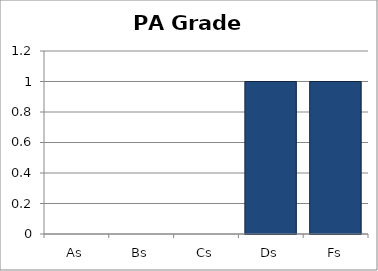
| Category | Distribution of Grades |
|---|---|
| As | 0 |
| Bs | 0 |
| Cs | 0 |
| Ds | 1 |
| Fs | 1 |